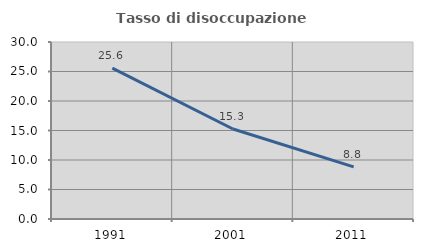
| Category | Tasso di disoccupazione giovanile  |
|---|---|
| 1991.0 | 25.581 |
| 2001.0 | 15.254 |
| 2011.0 | 8.824 |